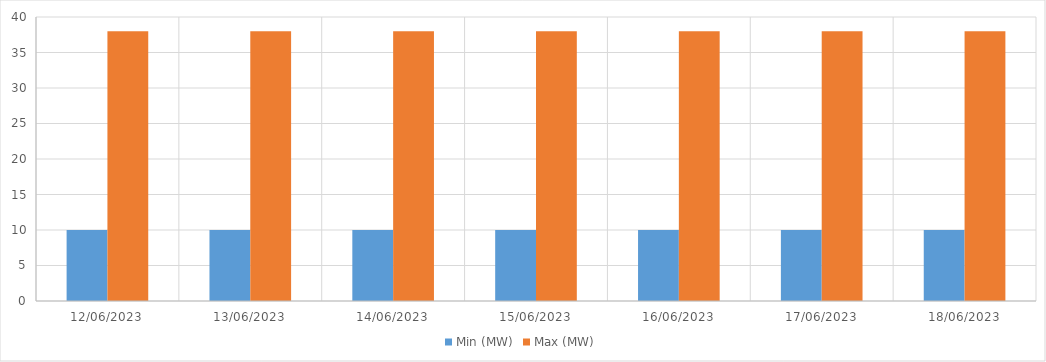
| Category | Min (MW) | Max (MW) |
|---|---|---|
| 12/06/2023 | 10 | 38 |
| 13/06/2023 | 10 | 38 |
| 14/06/2023 | 10 | 38 |
| 15/06/2023 | 10 | 38 |
| 16/06/2023 | 10 | 38 |
| 17/06/2023 | 10 | 38 |
| 18/06/2023 | 10 | 38 |